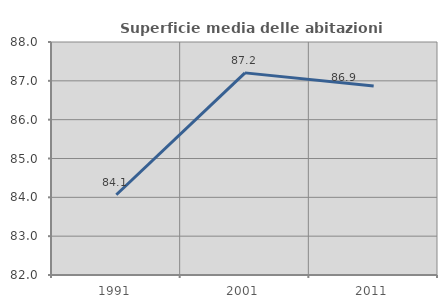
| Category | Superficie media delle abitazioni occupate |
|---|---|
| 1991.0 | 84.067 |
| 2001.0 | 87.205 |
| 2011.0 | 86.869 |